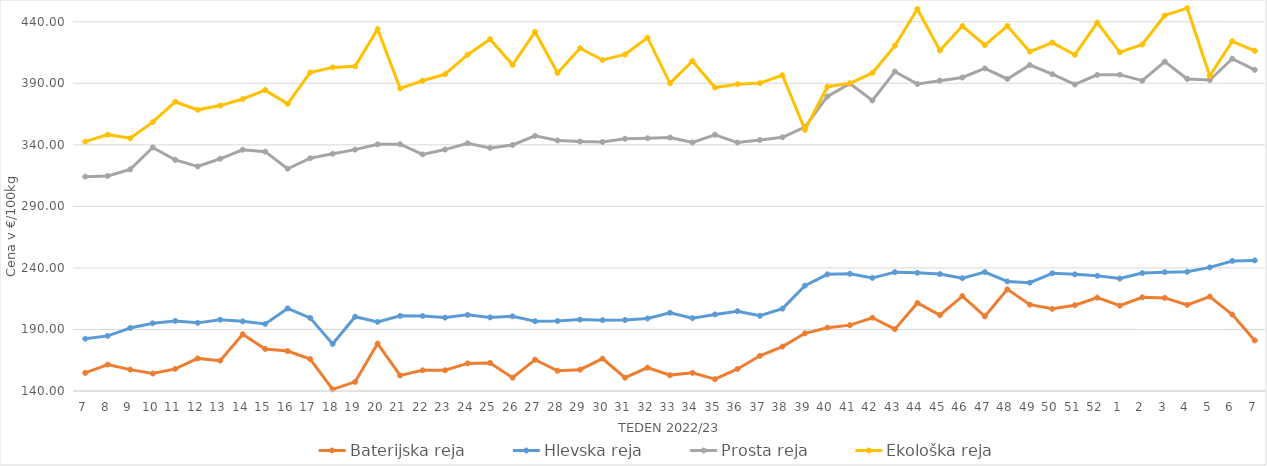
| Category | Baterijska reja | Hlevska reja | Prosta reja | Ekološka reja |
|---|---|---|---|---|
| 7.0 | 154.74 | 182.45 | 314.16 | 342.59 |
| 8.0 | 161.48 | 184.77 | 314.71 | 348.28 |
| 9.0 | 157.38 | 191.21 | 320.1 | 345.35 |
| 10.0 | 154.16 | 195.04 | 337.83 | 358.45 |
| 11.0 | 157.96 | 196.88 | 327.79 | 375 |
| 12.0 | 166.49 | 195.36 | 322.46 | 368.45 |
| 13.0 | 164.66 | 197.95 | 328.67 | 371.9 |
| 14.0 | 186.11 | 196.59 | 336.02 | 377.24 |
| 15.0 | 174.18 | 194.49 | 334.46 | 384.48 |
| 16.0 | 172.42 | 207.1 | 320.58 | 373.28 |
| 17.0 | 165.96 | 199.41 | 329.11 | 398.79 |
| 18.0 | 141.36 | 178.29 | 332.71 | 402.93 |
| 19.0 | 147.43 | 200.37 | 336.11 | 403.79 |
| 20.0 | 178.51 | 196.16 | 340.4 | 433.97 |
| 21.0 | 152.67 | 201.05 | 340.55 | 385.86 |
| 22.0 | 156.8 | 200.98 | 332.23 | 392.07 |
| 23.0 | 156.84 | 199.63 | 336.16 | 397.41 |
| 24.0 | 162.44 | 201.86 | 341.24 | 413.28 |
| 25.0 | 162.78 | 199.81 | 337.48 | 425.86 |
| 26.0 | 150.82 | 200.65 | 339.9 | 405 |
| 27.0 | 165.45 | 196.64 | 347.3 | 431.72 |
| 28.0 | 156.46 | 196.88 | 343.56 | 398.45 |
| 29.0 | 157.31 | 198.03 | 342.71 | 418.45 |
| 30.0 | 166.29 | 197.55 | 342.35 | 408.97 |
| 31.0 | 150.81 | 197.66 | 344.97 | 413.45 |
| 32.0 | 158.99 | 198.9 | 345.35 | 427.07 |
| 33.0 | 152.91 | 203.57 | 345.9 | 390 |
| 34.0 | 154.73 | 199.17 | 341.92 | 408.1 |
| 35.0 | 149.6 | 202.21 | 348.2 | 386.55 |
| 36.0 | 157.93 | 204.81 | 341.85 | 389.31 |
| 37.0 | 168.61 | 201.11 | 343.97 | 390.17 |
| 38.0 | 176.07 | 206.91 | 346.16 | 396.55 |
| 39.0 | 186.86 | 225.6 | 354.41 | 352.24 |
| 40.0 | 191.45 | 234.79 | 379.35 | 387.24 |
| 41.0 | 193.52 | 235.24 | 389.75 | 390 |
| 42.0 | 199.51 | 231.92 | 376.02 | 398.45 |
| 43.0 | 190.28 | 236.56 | 399.51 | 420.52 |
| 44.0 | 211.53 | 236.04 | 389.44 | 450.35 |
| 45.0 | 201.69 | 235.01 | 392.15 | 416.72 |
| 46.0 | 217.08 | 231.68 | 394.71 | 436.55 |
| 47.0 | 200.62 | 236.65 | 402.12 | 421.03 |
| 48.0 | 222.61 | 229.05 | 393.56 | 436.55 |
| 49.0 | 210.16 | 228.03 | 404.87 | 415.69 |
| 50.0 | 206.76 | 235.63 | 397.4 | 423.1 |
| 51.0 | 209.69 | 234.79 | 389.05 | 413.1 |
| 52.0 | 215.87 | 233.58 | 396.87 | 439.31 |
| 1.0 | 209.37 | 231.41 | 397.04 | 415.17 |
| 2.0 | 216.15 | 235.78 | 392.13 | 421.55 |
| 3.0 | 215.63 | 236.58 | 407.61 | 445.17 |
| 4.0 | 210 | 236.85 | 393.58 | 451.04 |
| 5.0 | 216.7 | 240.42 | 392.67 | 396.03 |
| 6.0 | 202.1 | 245.67 | 409.97 | 424.14 |
| 7.0 | 181.11 | 246.12 | 400.94 | 416.38 |